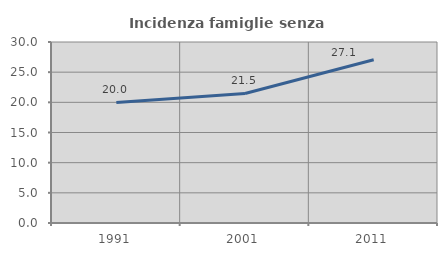
| Category | Incidenza famiglie senza nuclei |
|---|---|
| 1991.0 | 19.988 |
| 2001.0 | 21.471 |
| 2011.0 | 27.051 |